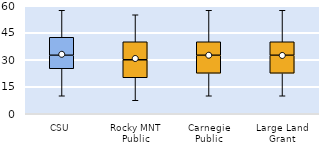
| Category | 25th | 50th | 75th |
|---|---|---|---|
| CSU | 25 | 7.5 | 10 |
| Rocky MNT Public | 20 | 10 | 10 |
| Carnegie Public | 22.5 | 10 | 7.5 |
| Large Land Grant | 22.5 | 10 | 7.5 |